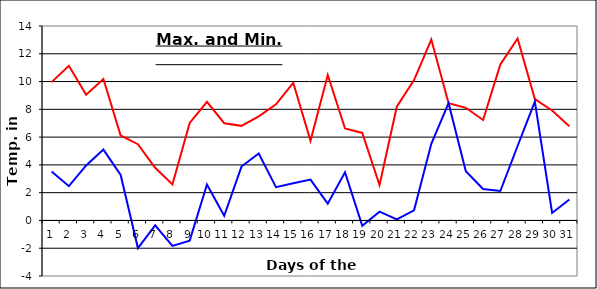
| Category | Series 0 | Series 1 |
|---|---|---|
| 0 | 9.96 | 3.53 |
| 1 | 11.13 | 2.47 |
| 2 | 9.05 | 3.96 |
| 3 | 10.18 | 5.1 |
| 4 | 6.12 | 3.27 |
| 5 | 5.49 | -1.99 |
| 6 | 3.79 | -0.35 |
| 7 | 2.59 | -1.83 |
| 8 | 7.02 | -1.45 |
| 9 | 8.54 | 2.59 |
| 10 | 7 | 0.34 |
| 11 | 6.81 | 3.88 |
| 12 | 7.5 | 4.82 |
| 13 | 8.36 | 2.4 |
| 14 | 9.91 | 2.68 |
| 15 | 5.73 | 2.94 |
| 16 | 10.47 | 1.21 |
| 17 | 6.62 | 3.47 |
| 18 | 6.3 | -0.38 |
| 19 | 2.55 | 0.63 |
| 20 | 8.19 | 0.07 |
| 21 | 10.11 | 0.73 |
| 22 | 13.02 | 5.52 |
| 23 | 8.44 | 8.44 |
| 24 | 8.11 | 3.54 |
| 25 | 7.232 | 2.26 |
| 26 | 11.23 | 2.12 |
| 27 | 13.1 | 5.36 |
| 28 | 8.74 | 8.55 |
| 29 | 7.92 | 0.54 |
| 30 | 6.78 | 1.51 |